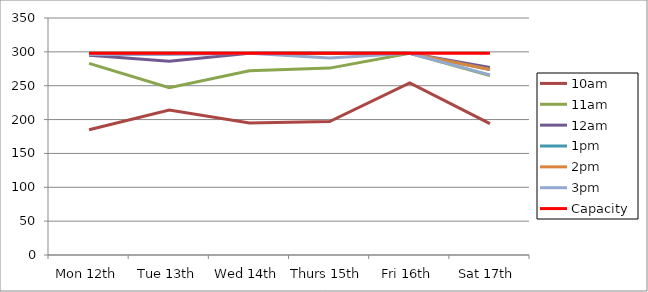
| Category | 9am | 10am | 11am | 12am | 1pm | 2pm | 3pm | 4pm | 5pm | Capacity |
|---|---|---|---|---|---|---|---|---|---|---|
| Mon 12th |  | 185 | 283 | 295 | 298 | 298 | 296 |  |  | 298 |
| Tue 13th |  | 214 | 247 | 286 | 298 | 298 | 296 |  |  | 298 |
| Wed 14th |  | 195 | 272 | 298 | 298 | 298 | 298 |  |  | 298 |
| Thurs 15th |  | 197 | 276 | 298 | 298 | 298 | 291 |  |  | 298 |
| Fri 16th |  | 254 | 298 | 298 | 298 | 298 | 298 |  |  | 298 |
| Sat 17th |  | 194 | 265 | 277 | 274 | 274 | 266 |  |  | 298 |